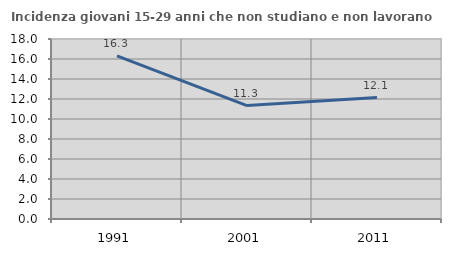
| Category | Incidenza giovani 15-29 anni che non studiano e non lavorano  |
|---|---|
| 1991.0 | 16.315 |
| 2001.0 | 11.34 |
| 2011.0 | 12.14 |